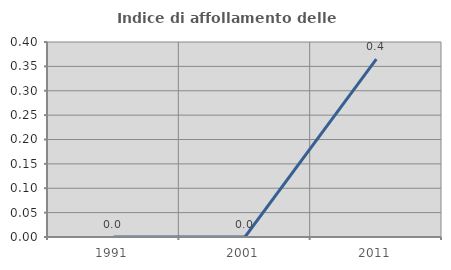
| Category | Indice di affollamento delle abitazioni  |
|---|---|
| 1991.0 | 0 |
| 2001.0 | 0 |
| 2011.0 | 0.365 |